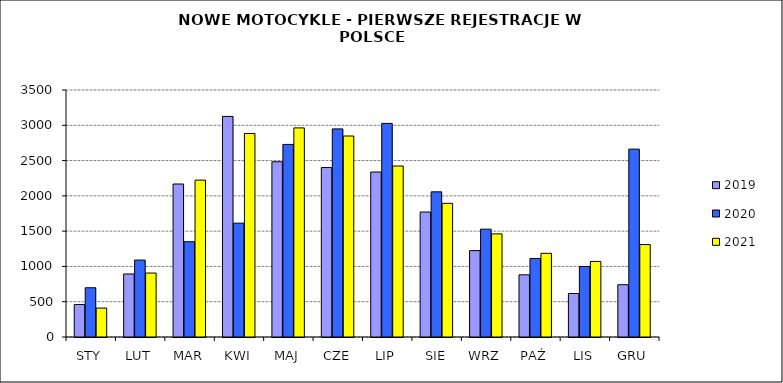
| Category | 2019 | 2020 | 2021 |
|---|---|---|---|
|  STY  | 460 | 698 | 410 |
|  LUT  | 893 | 1090 | 906 |
| MAR | 2168 | 1350 | 2223 |
| KWI | 3126 | 1613 | 2884 |
| MAJ | 2483 | 2729 | 2963 |
| CZE | 2401 | 2949 | 2848 |
| LIP | 2338 | 3027 | 2423 |
| SIE | 1771 | 2057 | 1894 |
| WRZ | 1224 | 1528 | 1461 |
| PAŹ | 881 | 1113 | 1186 |
| LIS | 617 | 999 | 1071 |
| GRU | 741 | 2662 | 1310 |